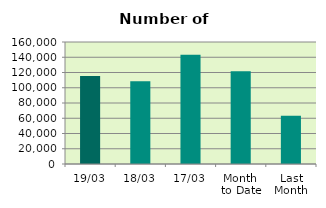
| Category | Series 0 |
|---|---|
| 19/03 | 115490 |
| 18/03 | 108390 |
| 17/03 | 143118 |
| Month 
to Date | 121612 |
| Last
Month | 63353.4 |